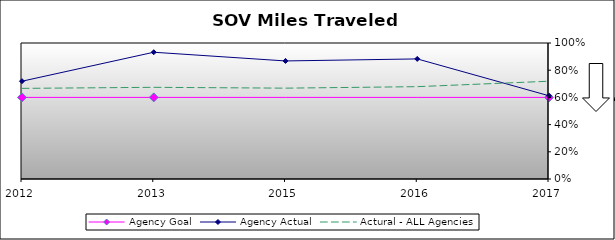
| Category | Agency Goal | Agency Actual | Actural - ALL Agencies |
|---|---|---|---|
| 2012.0 | 0.6 | 0.719 | 0.666 |
| 2013.0 | 0.6 | 0.932 | 0.674 |
| 2015.0 | 0.6 | 0.868 | 0.668 |
| 2016.0 | 0.6 | 0.883 | 0.679 |
| 2017.0 | 0.6 | 0.612 | 0.719 |